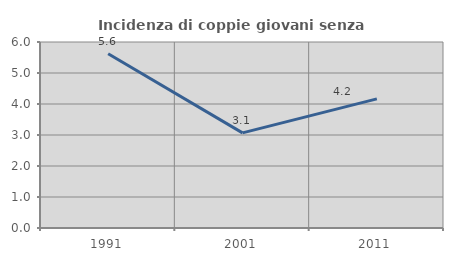
| Category | Incidenza di coppie giovani senza figli |
|---|---|
| 1991.0 | 5.621 |
| 2001.0 | 3.067 |
| 2011.0 | 4.167 |